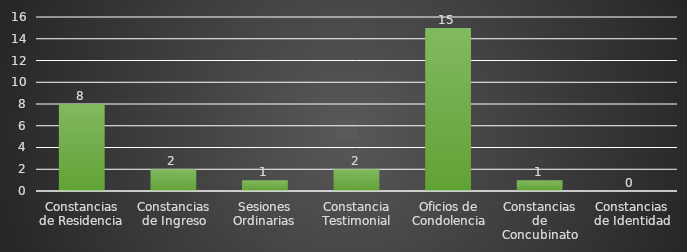
| Category | INDICADOR  |
|---|---|
| Constancias de Residencia | 8 |
| Constancias de Ingreso | 2 |
| Sesiones Ordinarias | 1 |
| Constancia Testimonial | 2 |
| Oficios de Condolencia | 15 |
| Constancias de Concubinato | 1 |
| Constancias de Identidad | 0 |